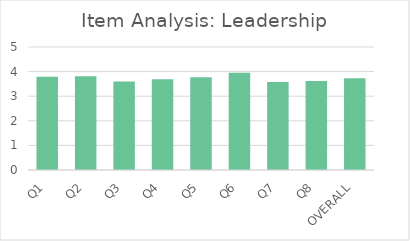
| Category | Series 0 |
|---|---|
| Q1 | 3.79 |
| Q2 | 3.81 |
| Q3 | 3.6 |
| Q4 | 3.69 |
| Q5 | 3.77 |
| Q6 | 3.95 |
| Q7 | 3.58 |
| Q8 | 3.62 |
| OVERALL | 3.73 |